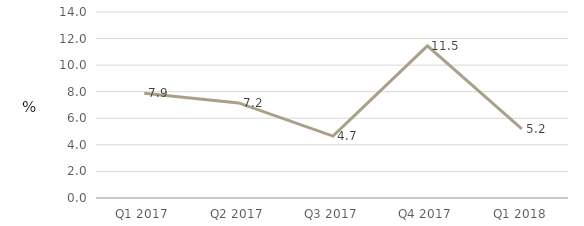
| Category | General government |
|---|---|
| Q1 2017 | 7.887 |
| Q2 2017 | 7.155 |
| Q3 2017 | 4.662 |
| Q4 2017 | 11.456 |
| Q1 2018 | 5.21 |